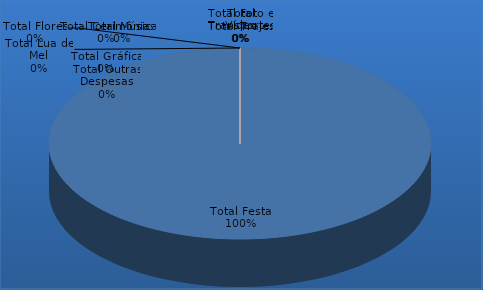
| Category | Series 0 |
|---|---|
| Total Festa | 1 |
| Total Trajes | 0 |
| Total Foto e Vídeo | 0 |
| Total Música | 0 |
| Total Flores | 0 |
| Total Gráfica | 0 |
| Total Transportes | 0 |
| Total Cerimônias | 0 |
| Total Lua de Mel | 0 |
| Total Outras Despesas | 0 |